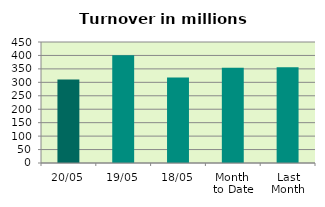
| Category | Series 0 |
|---|---|
| 20/05 | 310.232 |
| 19/05 | 400.828 |
| 18/05 | 318.111 |
| Month 
to Date | 354.611 |
| Last
Month | 356.105 |